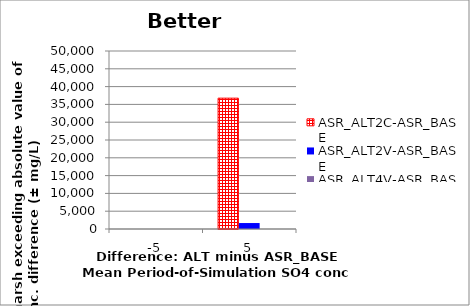
| Category | ASR_ALT2C-ASR_BASE | ASR_ALT2V-ASR_BASE | ASR_ALT4V-ASR_BASE |
|---|---|---|---|
| -5.0 | 0 | 0 | 0 |
| 5.0 | 36750 | 1675 | 0 |